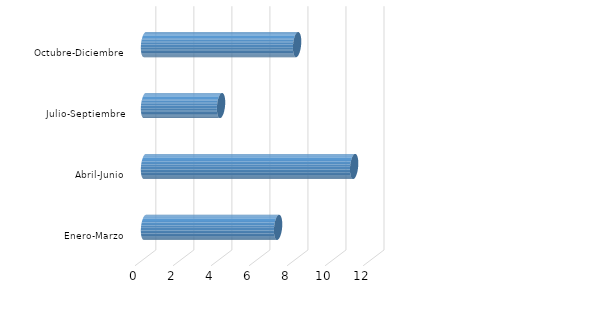
| Category | Empresas Auditadas |
|---|---|
| Enero-Marzo | 7 |
| Abril-Junio | 11 |
| Julio-Septiembre | 4 |
| Octubre-Diciembre | 8 |